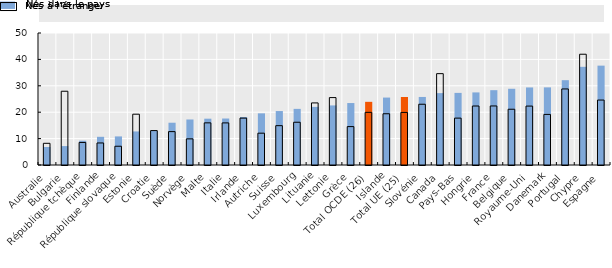
| Category | Nés à l’étranger | Nés dans le pays |
|---|---|---|
| Australie | 6.817 | 8.22 |
| Bulgarie | 7.166 | 27.938 |
| République tchèque | 9.201 | 8.542 |
| Finlande | 10.681 | 8.35 |
| République slovaque | 10.826 | 7.108 |
| Estonie | 12.711 | 19.246 |
| Croatie | 12.897 | 13.044 |
| Suède | 16.015 | 12.645 |
| Norvège | 17.239 | 9.899 |
| Malte | 17.544 | 15.968 |
| Italie | 17.605 | 15.947 |
| Irlande | 18.176 | 17.757 |
| Autriche | 19.568 | 12.053 |
| Suisse | 20.439 | 14.898 |
| Luxembourg | 21.262 | 16.198 |
| Lituanie | 22.01 | 23.52 |
| Lettonie | 22.568 | 25.535 |
| Grèce | 23.469 | 14.544 |
| Total OCDE (26) | 23.929 | 19.943 |
| Islande | 25.544 | 19.41 |
| Total UE (25) | 25.748 | 19.913 |
| Slovénie | 25.775 | 23.016 |
| Canada | 27.228 | 34.603 |
| Pays-Bas | 27.316 | 17.759 |
| Hongrie | 27.496 | 22.347 |
| France | 28.342 | 22.365 |
| Belgique | 28.872 | 21.123 |
| Royaume-Uni | 29.374 | 22.316 |
| Danemark | 29.399 | 19.16 |
| Portugal | 32.129 | 28.811 |
| Chypre | 37.189 | 41.959 |
| Espagne | 37.637 | 24.598 |